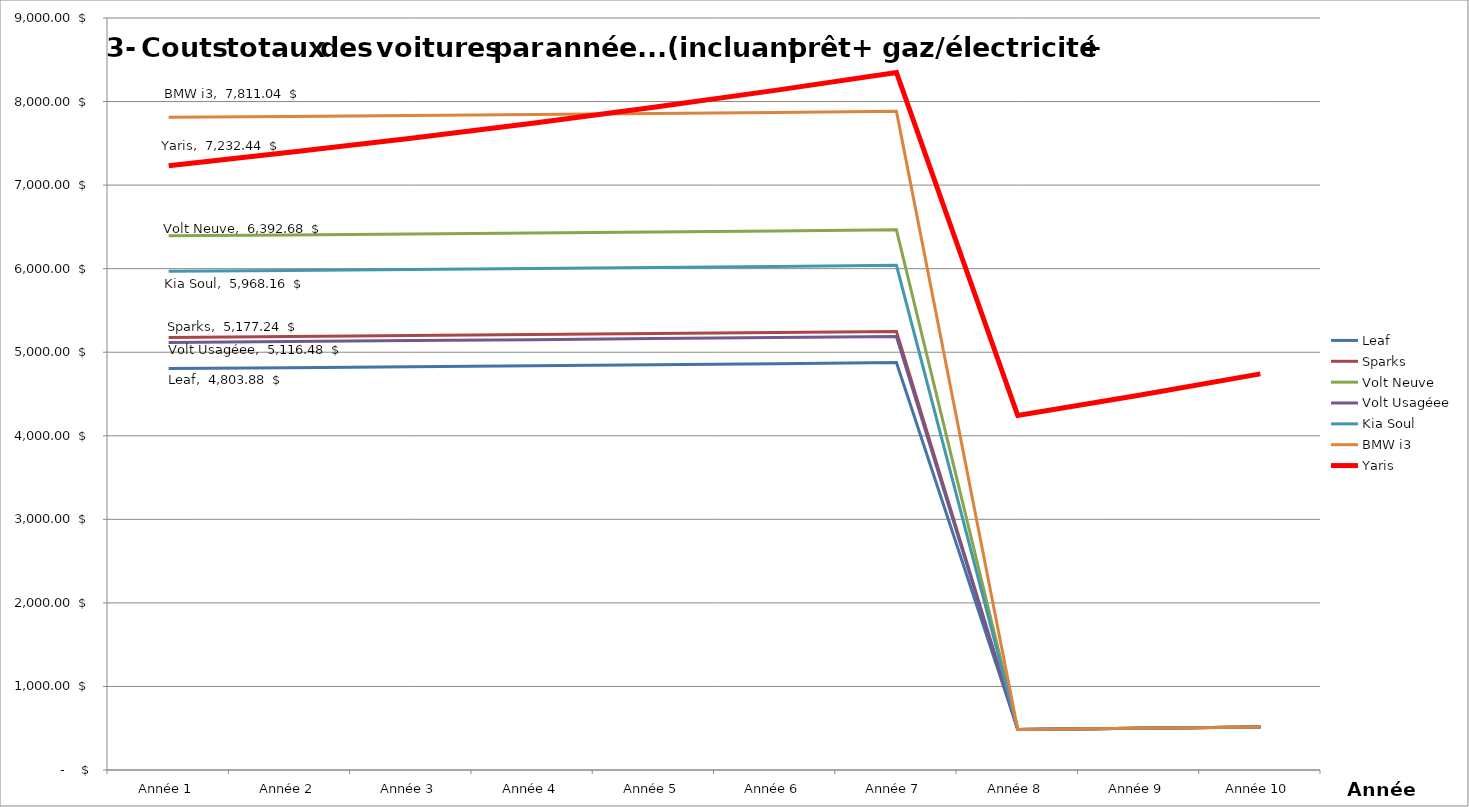
| Category | Leaf | Sparks | Volt Neuve | Volt Usagéee | Kia Soul | BMW i3 | Yaris |
|---|---|---|---|---|---|---|---|
| Année 1 | 4803.88 | 5177.24 | 6392.68 | 5116.48 | 5968.16 | 7811.04 | 7232.443 |
| Année 2 | 4814.88 | 5188.24 | 6403.68 | 5127.48 | 5979.16 | 7822.04 | 7392.443 |
| Année 3 | 4826.25 | 5199.61 | 6415.05 | 5138.85 | 5990.53 | 7833.41 | 7561.943 |
| Année 4 | 4838.005 | 5211.365 | 6426.805 | 5150.605 | 6002.285 | 7845.165 | 7741.568 |
| Année 5 | 4850.16 | 5223.52 | 6438.96 | 5162.76 | 6014.44 | 7857.32 | 7931.989 |
| Année 6 | 4862.732 | 5236.092 | 6451.532 | 5175.332 | 6027.012 | 7869.892 | 8133.928 |
| Année 7 | 4875.738 | 5249.098 | 6464.538 | 5188.338 | 6040.018 | 7882.898 | 8348.16 |
| Année 8 | 485.316 | 485.316 | 485.316 | 485.316 | 485.316 | 485.316 | 4243.076 |
| Année 9 | 499.243 | 499.243 | 499.243 | 499.243 | 499.243 | 499.243 | 4484.461 |
| Année 10 | 513.661 | 513.661 | 513.661 | 513.661 | 513.661 | 513.661 | 4740.838 |